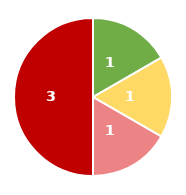
| Category | Series 0 |
|---|---|
| Niedrig | 1 |
| Mittel | 1 |
| Hoch | 1 |
| Kritisch | 3 |